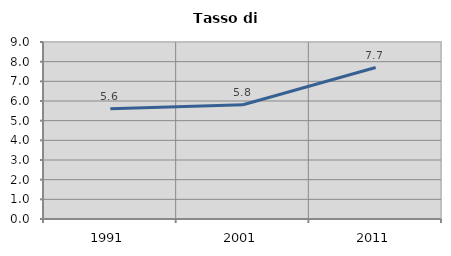
| Category | Tasso di disoccupazione   |
|---|---|
| 1991.0 | 5.603 |
| 2001.0 | 5.812 |
| 2011.0 | 7.701 |